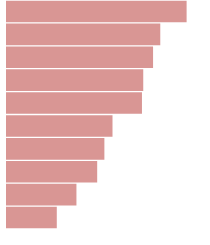
| Category | Series 0 |
|---|---|
| 0 | 4490157.923 |
| 1 | 3831834.659 |
| 2 | 3651518.813 |
| 3 | 3406075.253 |
| 4 | 3374040 |
| 5 | 2637436.143 |
| 6 | 2434556.44 |
| 7 | 2254556.44 |
| 8 | 1735917.33 |
| 9 | 1244705 |